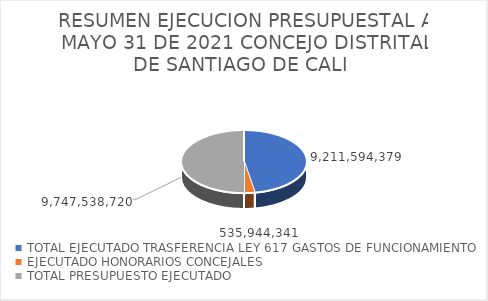
| Category | Series 0 |
|---|---|
| TOTAL EJECUTADO TRASFERENCIA LEY 617 GASTOS DE FUNCIONAMIENTO  | 9211594379 |
| EJECUTADO HONORARIOS CONCEJALES  | 535944341 |
| TOTAL PRESUPUESTO EJECUTADO  | 9747538720 |